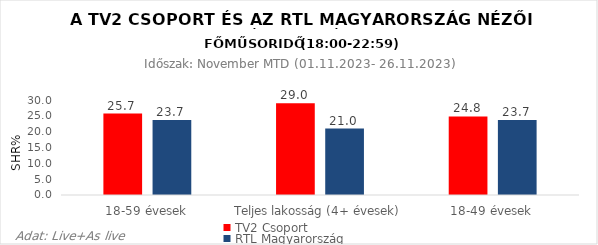
| Category | TV2 Csoport | RTL Magyarország |
|---|---|---|
| 18-59 évesek | 25.7 | 23.7 |
| Teljes lakosság (4+ évesek) | 29 | 21 |
| 18-49 évesek | 24.8 | 23.7 |